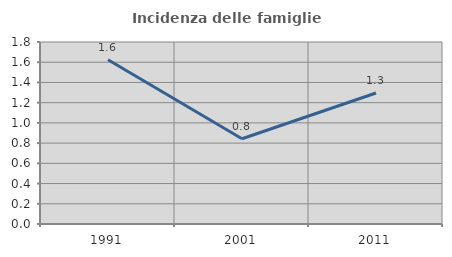
| Category | Incidenza delle famiglie numerose |
|---|---|
| 1991.0 | 1.624 |
| 2001.0 | 0.843 |
| 2011.0 | 1.296 |